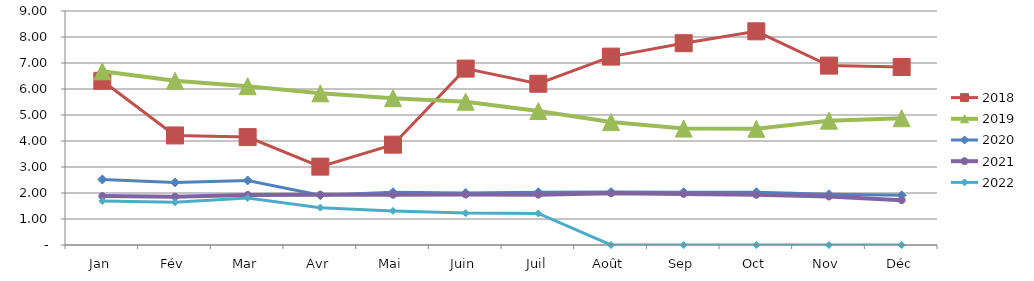
| Category | 2018 | 2019 | 2020 | 2021 | 2022 |
|---|---|---|---|---|---|
| Jan | 6.315 | 6.68 | 2.521 | 1.881 | 1.692 |
| Fév | 4.213 | 6.315 | 2.407 | 1.859 | 1.644 |
| Mar | 4.15 | 6.109 | 2.483 | 1.927 | 1.805 |
| Avr | 3.014 | 5.832 | 1.915 | 1.933 | 1.437 |
| Mai | 3.859 | 5.648 | 2.029 | 1.933 | 1.311 |
| Juin | 6.784 | 5.512 | 2.001 | 1.94 | 1.227 |
| Juil | 6.203 | 5.152 | 2.027 | 1.937 | 1.213 |
| Août | 7.245 | 4.728 | 2.036 | 1.987 | 0 |
| Sep | 7.761 | 4.477 | 2.029 | 1.965 | 0 |
| Oct | 8.218 | 4.47 | 2.032 | 1.931 | 0 |
| Nov | 6.9 | 4.782 | 1.95 | 1.865 | 0 |
| Déc | 6.846 | 4.875 | 1.91 | 1.725 | 0 |